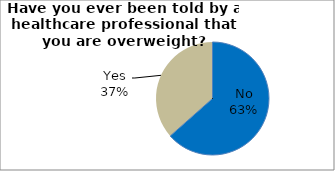
| Category | Series 0 |
|---|---|
| No | 63.459 |
| Yes | 36.541 |